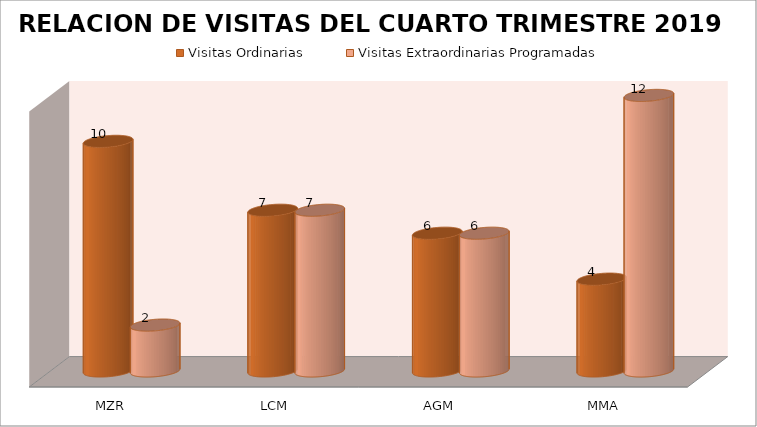
| Category | Visitas Ordinarias | Visitas Extraordinarias Programadas |
|---|---|---|
| MZR | 10 | 2 |
| LCM | 7 | 7 |
| AGM | 6 | 6 |
| MMA | 4 | 12 |